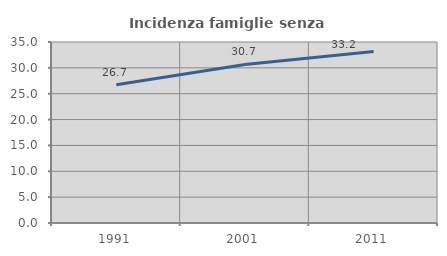
| Category | Incidenza famiglie senza nuclei |
|---|---|
| 1991.0 | 26.73 |
| 2001.0 | 30.658 |
| 2011.0 | 33.152 |